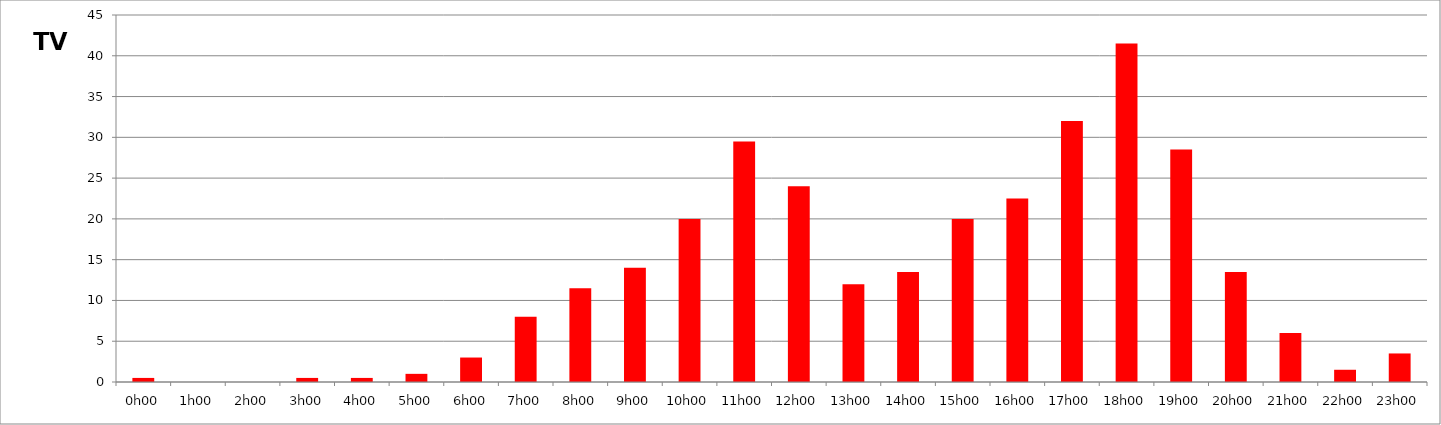
| Category | TV |
|---|---|
| 0.0 | 0.5 |
| 0.041666666666666664 | 0 |
| 0.08333333333333333 | 0 |
| 0.125 | 0.5 |
| 0.16666666666666666 | 0.5 |
| 0.20833333333333334 | 1 |
| 0.25 | 3 |
| 0.2916666666666667 | 8 |
| 0.3333333333333333 | 11.5 |
| 0.375 | 14 |
| 0.4166666666666667 | 20 |
| 0.4583333333333333 | 29.5 |
| 0.5 | 24 |
| 0.5416666666666666 | 12 |
| 0.5833333333333334 | 13.5 |
| 0.625 | 20 |
| 0.6666666666666666 | 22.5 |
| 0.7083333333333334 | 32 |
| 0.75 | 41.5 |
| 0.7916666666666666 | 28.5 |
| 0.8333333333333334 | 13.5 |
| 0.875 | 6 |
| 0.9166666666666666 | 1.5 |
| 0.9583333333333334 | 3.5 |